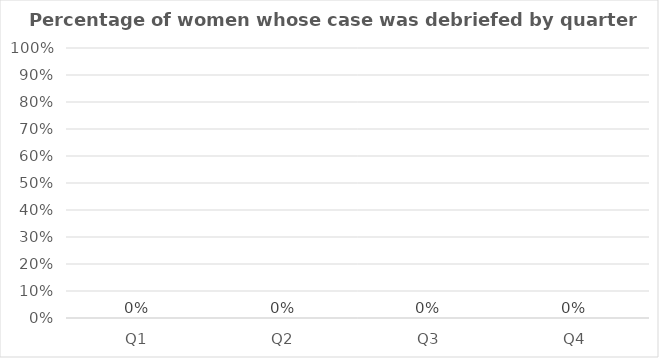
| Category | Percentage of women whose case was debriefed |
|---|---|
| Q1 | 0 |
| Q2 | 0 |
| Q3 | 0 |
| Q4 | 0 |